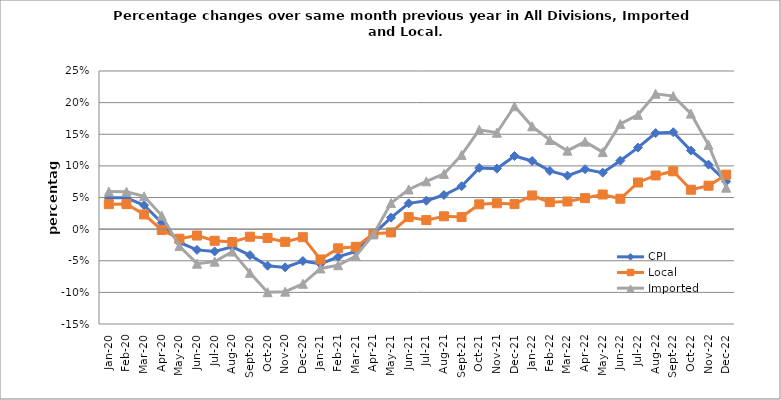
| Category | CPI | Local | Imported |
|---|---|---|---|
| 2020-01-01 | 0.049 | 0.039 | 0.059 |
| 2020-02-01 | 0.05 | 0.04 | 0.059 |
| 2020-03-01 | 0.038 | 0.023 | 0.052 |
| 2020-04-01 | 0.01 | -0.001 | 0.021 |
| 2020-05-01 | -0.021 | -0.015 | -0.027 |
| 2020-06-01 | -0.033 | -0.01 | -0.055 |
| 2020-07-01 | -0.035 | -0.018 | -0.051 |
| 2020-08-01 | -0.028 | -0.02 | -0.036 |
| 2020-09-01 | -0.041 | -0.012 | -0.069 |
| 2020-10-01 | -0.058 | -0.014 | -0.1 |
| 2020-11-01 | -0.06 | -0.02 | -0.099 |
| 2020-12-01 | -0.05 | -0.013 | -0.086 |
| 2021-01-01 | -0.055 | -0.048 | -0.062 |
| 2021-02-01 | -0.044 | -0.03 | -0.057 |
| 2021-03-01 | -0.035 | -0.028 | -0.043 |
| 2021-04-01 | -0.008 | -0.007 | -0.008 |
| 2021-05-01 | 0.018 | -0.005 | 0.041 |
| 2021-06-01 | 0.041 | 0.019 | 0.063 |
| 2021-07-01 | 0.045 | 0.014 | 0.075 |
| 2021-08-01 | 0.054 | 0.02 | 0.087 |
| 2021-09-01 | 0.068 | 0.019 | 0.117 |
| 2021-10-01 | 0.097 | 0.039 | 0.157 |
| 2021-11-01 | 0.096 | 0.041 | 0.152 |
| 2021-12-01 | 0.116 | 0.04 | 0.194 |
| 2022-01-01 | 0.108 | 0.053 | 0.163 |
| 2022-02-01 | 0.092 | 0.043 | 0.141 |
| 2022-03-01 | 0.085 | 0.044 | 0.124 |
| 2022-04-01 | 0.095 | 0.049 | 0.138 |
| 2022-05-01 | 0.089 | 0.055 | 0.122 |
| 2022-06-01 | 0.108 | 0.048 | 0.166 |
| 2022-07-01 | 0.129 | 0.074 | 0.181 |
| 2022-08-01 | 0.152 | 0.085 | 0.214 |
| 2022-09-01 | 0.153 | 0.091 | 0.21 |
| 2022-10-01 | 0.124 | 0.062 | 0.183 |
| 2022-11-01 | 0.102 | 0.069 | 0.133 |
| 2022-12-01 | 0.075 | 0.086 | 0.066 |